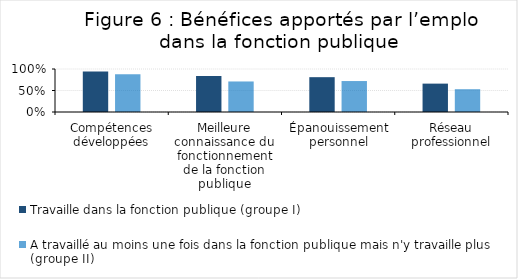
| Category | Travaille dans la fonction publique (groupe I) | A travaillé au moins une fois dans la fonction publique mais n'y travaille plus (groupe II) |
|---|---|---|
| Compétences développées | 0.94 | 0.88 |
| Meilleure connaissance du fonctionnement de la fonction publique | 0.84 | 0.71 |
| Épanouissement personnel | 0.81 | 0.72 |
| Réseau professionnel | 0.66 | 0.53 |